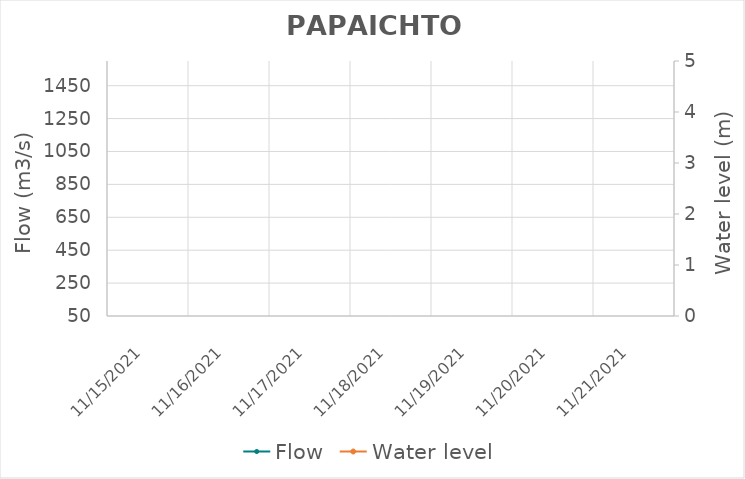
| Category | Flow |
|---|---|
| 11/1/21 | 423.32 |
| 10/31/21 | 413.63 |
| 10/30/21 | 470.23 |
| 10/29/21 | 460.16 |
| 10/28/21 | 468.63 |
| 10/27/21 | 451.08 |
| 10/26/21 | 422.46 |